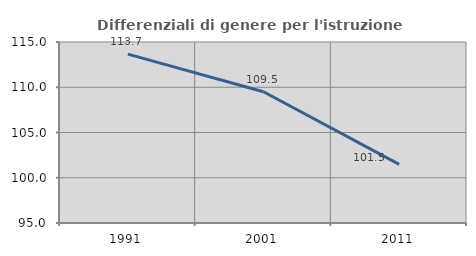
| Category | Differenziali di genere per l'istruzione superiore |
|---|---|
| 1991.0 | 113.66 |
| 2001.0 | 109.508 |
| 2011.0 | 101.479 |